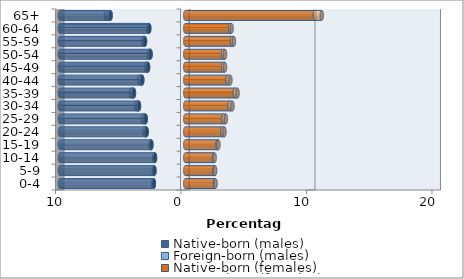
| Category | Native-born (males) | Foreign-born (males) | Native-born (females) | Foreign-born (females) |
|---|---|---|---|---|
| 0-4 | -2.501 | -0.048 | 2.367 | 0.046 |
| 5-9 | -2.452 | -0.057 | 2.329 | 0.054 |
| 10-14 | -2.408 | -0.063 | 2.285 | 0.059 |
| 15-19 | -2.695 | -0.081 | 2.572 | 0.075 |
| 20-24 | -3.072 | -0.187 | 2.954 | 0.174 |
| 25-29 | -3.15 | -0.219 | 3.03 | 0.21 |
| 30-34 | -3.686 | -0.234 | 3.532 | 0.23 |
| 35-39 | -4.087 | -0.239 | 3.939 | 0.229 |
| 40-44 | -3.424 | -0.247 | 3.372 | 0.228 |
| 45-49 | -2.961 | -0.167 | 3.012 | 0.157 |
| 50-54 | -2.763 | -0.154 | 3.015 | 0.158 |
| 55-59 | -3.205 | -0.13 | 3.732 | 0.149 |
| 60-64 | -2.865 | -0.1 | 3.566 | 0.13 |
| 65+ | -5.949 | -0.373 | 10.326 | 0.55 |